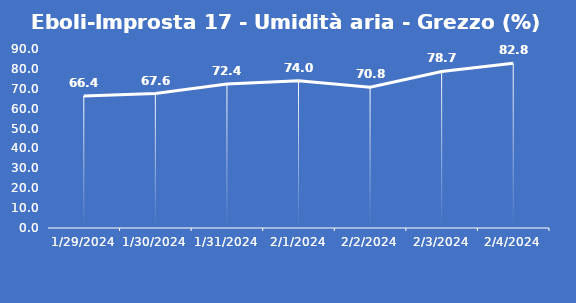
| Category | Eboli-Improsta 17 - Umidità aria - Grezzo (%) |
|---|---|
| 1/29/24 | 66.4 |
| 1/30/24 | 67.6 |
| 1/31/24 | 72.4 |
| 2/1/24 | 74 |
| 2/2/24 | 70.8 |
| 2/3/24 | 78.7 |
| 2/4/24 | 82.8 |